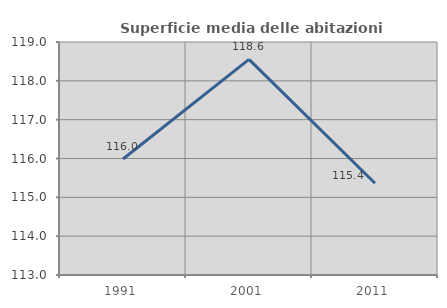
| Category | Superficie media delle abitazioni occupate |
|---|---|
| 1991.0 | 115.988 |
| 2001.0 | 118.553 |
| 2011.0 | 115.362 |